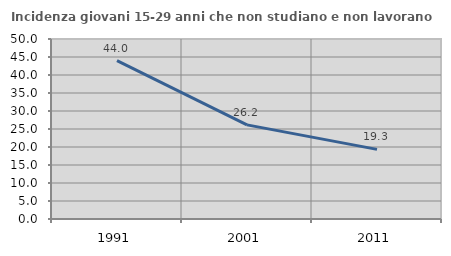
| Category | Incidenza giovani 15-29 anni che non studiano e non lavorano  |
|---|---|
| 1991.0 | 44 |
| 2001.0 | 26.151 |
| 2011.0 | 19.341 |